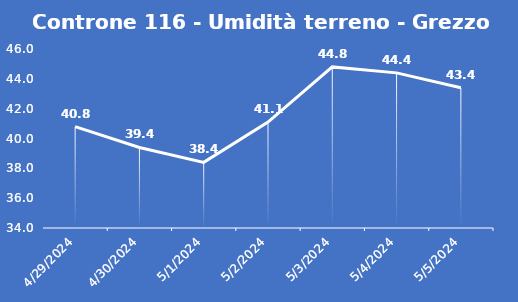
| Category | Controne 116 - Umidità terreno - Grezzo (%VWC) |
|---|---|
| 4/29/24 | 40.8 |
| 4/30/24 | 39.4 |
| 5/1/24 | 38.4 |
| 5/2/24 | 41.1 |
| 5/3/24 | 44.8 |
| 5/4/24 | 44.4 |
| 5/5/24 | 43.4 |